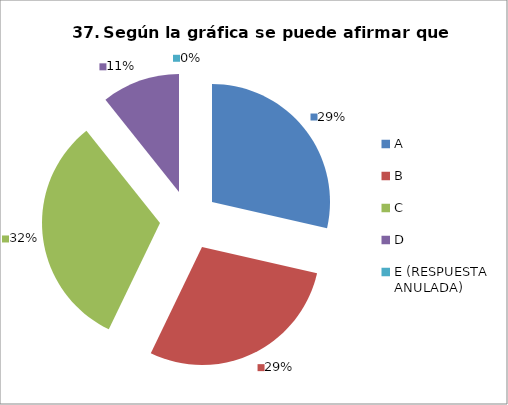
| Category | CANTIDAD DE RESPUESTAS PREGUNTA (37) | PORCENTAJE |
|---|---|---|
| A | 8 | 0.286 |
| B | 8 | 0.286 |
| C | 9 | 0.321 |
| D | 3 | 0.107 |
| E (RESPUESTA ANULADA) | 0 | 0 |